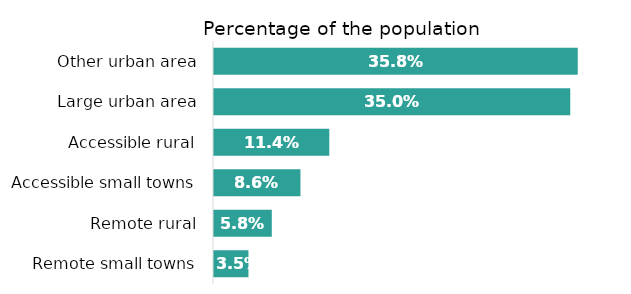
| Category | Percentage of total population |
|---|---|
| Remote small towns | 0.035 |
| Remote rural | 0.058 |
| Accessible small towns | 0.086 |
| Accessible rural | 0.114 |
| Large urban area | 0.35 |
| Other urban area | 0.358 |